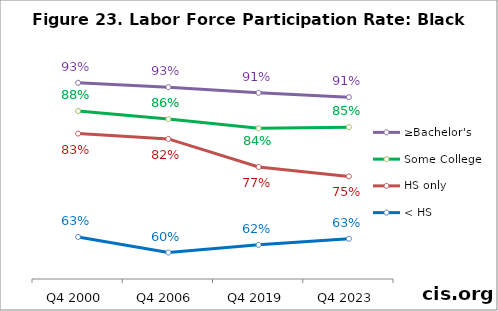
| Category | ≥Bachelor's | Some College | HS only | < HS |
|---|---|---|---|---|
| Q4 2000 | 0.934 | 0.879 | 0.835 | 0.632 |
| Q4 2006 | 0.925 | 0.863 | 0.824 | 0.602 |
| Q4 2019 | 0.914 | 0.845 | 0.769 | 0.617 |
| Q4 2023 | 0.906 | 0.847 | 0.751 | 0.629 |